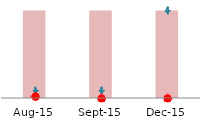
| Category | Series 1 |
|---|---|
| 2015-08-01 | 2280 |
| 2015-09-01 | 2280 |
| 2015-12-01 | 2280 |